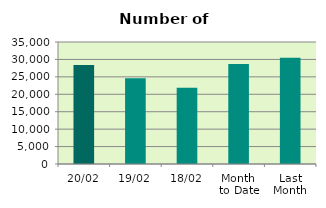
| Category | Series 0 |
|---|---|
| 20/02 | 28416 |
| 19/02 | 24616 |
| 18/02 | 21882 |
| Month 
to Date | 28698.857 |
| Last
Month | 30462.455 |